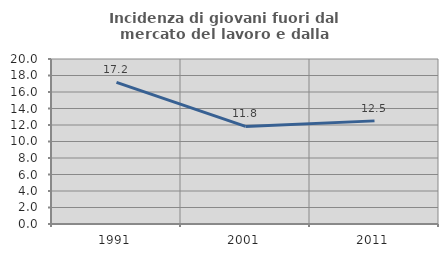
| Category | Incidenza di giovani fuori dal mercato del lavoro e dalla formazione  |
|---|---|
| 1991.0 | 17.169 |
| 2001.0 | 11.832 |
| 2011.0 | 12.5 |